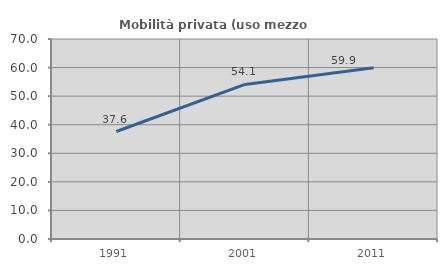
| Category | Mobilità privata (uso mezzo privato) |
|---|---|
| 1991.0 | 37.616 |
| 2001.0 | 54.101 |
| 2011.0 | 59.93 |